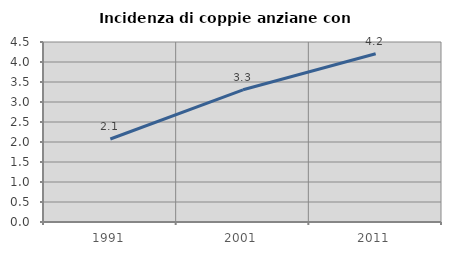
| Category | Incidenza di coppie anziane con figli |
|---|---|
| 1991.0 | 2.075 |
| 2001.0 | 3.305 |
| 2011.0 | 4.208 |